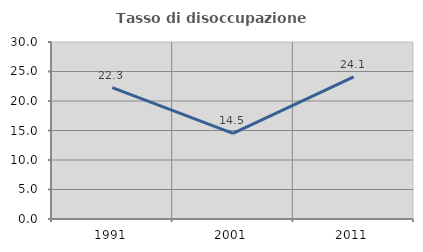
| Category | Tasso di disoccupazione giovanile  |
|---|---|
| 1991.0 | 22.251 |
| 2001.0 | 14.514 |
| 2011.0 | 24.077 |